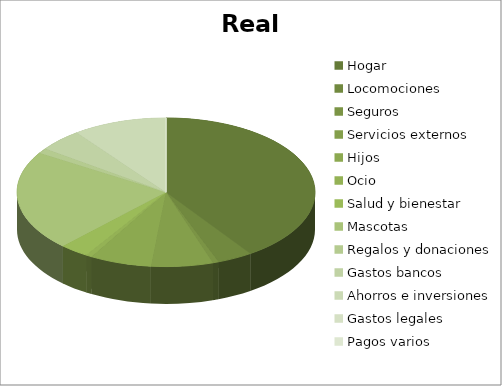
| Category | Real |
|---|---|
| Hogar | 1266 |
| Locomociones | 120 |
| Seguros | 20 |
| Servicios externos | 210 |
| Hijos | 210 |
| Ocio | 20 |
| Salud y bienestar | 100 |
| Mascotas | 680 |
| Regalos y donaciones | 35 |
| Gastos bancos | 150 |
| Ahorros e inversiones | 320 |
| Gastos legales | 0 |
| Pagos varios | 0 |